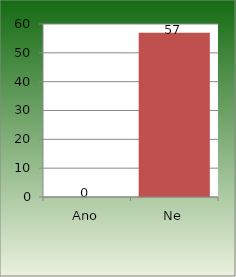
| Category | Series 0 |
|---|---|
| Ano | 0 |
| Ne | 57 |